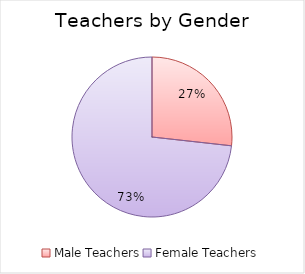
| Category | Series 0 |
|---|---|
| Male Teachers | 64488 |
| Female Teachers | 176530 |